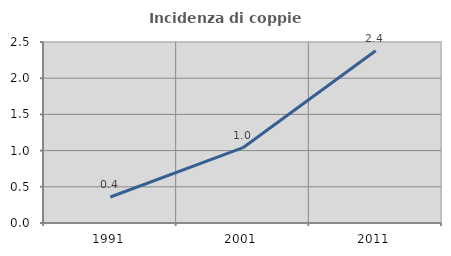
| Category | Incidenza di coppie miste |
|---|---|
| 1991.0 | 0.359 |
| 2001.0 | 1.04 |
| 2011.0 | 2.38 |